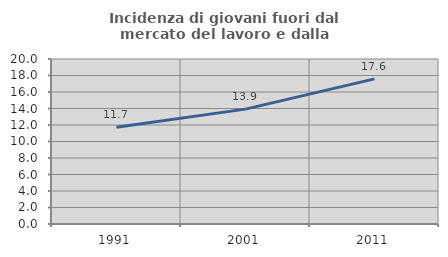
| Category | Incidenza di giovani fuori dal mercato del lavoro e dalla formazione  |
|---|---|
| 1991.0 | 11.724 |
| 2001.0 | 13.924 |
| 2011.0 | 17.593 |